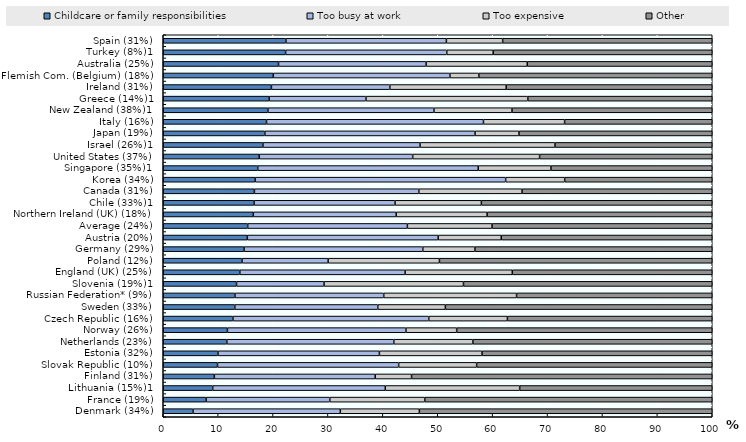
| Category | Childcare or family responsibilities | Too busy at work | Too expensive | Other |
|---|---|---|---|---|
| Denmark (34%) | 5.424 | 26.829 | 14.395 | 53.352 |
| France (19%) | 7.812 | 22.525 | 17.298 | 52.365 |
| Lithuania (15%)1 | 9.01 | 31.435 | 24.478 | 35.077 |
| Finland (31%) | 9.308 | 29.3 | 6.62 | 54.772 |
| Slovak Republic (10%) | 9.883 | 32.994 | 14.201 | 42.921 |
| Estonia (32%) | 9.968 | 29.405 | 18.696 | 41.93 |
| Netherlands (23%) | 11.583 | 30.414 | 14.403 | 43.6 |
| Norway (26%) | 11.692 | 32.513 | 9.242 | 46.553 |
| Czech Republic (16%) | 12.696 | 35.67 | 14.321 | 37.313 |
| Sweden (33%) | 13.035 | 26.042 | 12.313 | 48.61 |
| Russian Federation* (9%) | 13.063 | 27.098 | 24.194 | 35.645 |
| Slovenia (19%)1 | 13.346 | 15.948 | 25.392 | 45.314 |
| England (UK) (25%) | 13.946 | 30.11 | 19.522 | 36.423 |
| Poland (12%) | 14.348 | 15.685 | 20.277 | 49.691 |
| Germany (29%) | 14.728 | 32.55 | 9.487 | 43.235 |
| Austria (20%) | 15.318 | 34.764 | 11.483 | 38.435 |
| Average (24%) | 15.382 | 29.086 | 15.423 | 40.109 |
| Northern Ireland (UK) (18%) | 16.403 | 26.027 | 16.563 | 41.007 |
| Chile (33%)1 | 16.543 | 25.683 | 15.721 | 42.052 |
| Canada (31%) | 16.603 | 29.95 | 18.81 | 34.637 |
| Korea (34%) | 16.739 | 45.633 | 10.751 | 26.877 |
| Singapore (35%)1 | 17.213 | 40.165 | 13.242 | 29.38 |
| United States (37%) | 17.492 | 27.943 | 23.117 | 31.448 |
| Israel (26%)1 | 18.161 | 28.619 | 24.582 | 28.638 |
| Japan (19%) | 18.507 | 38.291 | 8.001 | 35.201 |
| Italy (16%) | 18.811 | 39.516 | 14.779 | 26.894 |
| New Zealand (38%)1 | 19.063 | 30.247 | 14.212 | 36.478 |
| Greece (14%)1 | 19.291 | 17.637 | 29.478 | 33.594 |
| Ireland (31%) | 19.701 | 21.573 | 21.198 | 37.528 |
| Flemish Com. (Belgium) (18%) | 20.05 | 32.168 | 5.266 | 42.516 |
| Australia (25%) | 20.995 | 26.884 | 18.428 | 33.693 |
| Turkey (8%)1 | 22.289 | 29.355 | 8.456 | 39.9 |
| Spain (31%) | 22.343 | 29.23 | 10.249 | 38.177 |